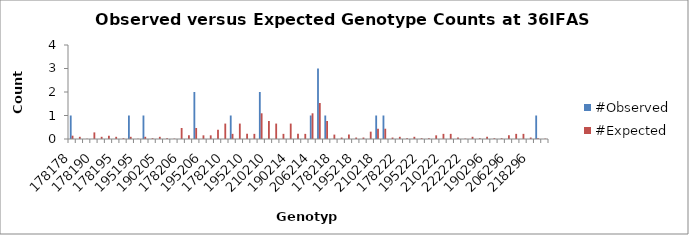
| Category | #Observed | #Expected |
|---|---|---|
| 178178.0 | 1 | 0.141 |
| 178182.0 | 0 | 0.094 |
| 182182.0 | 0 | 0.016 |
| 178190.0 | 0 | 0.281 |
| 182190.0 | 0 | 0.094 |
| 190190.0 | 0 | 0.141 |
| 178195.0 | 0 | 0.094 |
| 182195.0 | 0 | 0.031 |
| 190195.0 | 1 | 0.094 |
| 195195.0 | 0 | 0.016 |
| 178205.0 | 1 | 0.094 |
| 182205.0 | 0 | 0.031 |
| 190205.0 | 0 | 0.094 |
| 195205.0 | 0 | 0.031 |
| 205205.0 | 0 | 0.016 |
| 178206.0 | 0 | 0.469 |
| 182206.0 | 0 | 0.156 |
| 190206.0 | 2 | 0.469 |
| 195206.0 | 0 | 0.156 |
| 205206.0 | 0 | 0.156 |
| 206206.0 | 0 | 0.391 |
| 178210.0 | 0 | 0.656 |
| 182210.0 | 1 | 0.219 |
| 190210.0 | 0 | 0.656 |
| 195210.0 | 0 | 0.219 |
| 205210.0 | 0 | 0.219 |
| 206210.0 | 2 | 1.094 |
| 210210.0 | 0 | 0.766 |
| 178214.0 | 0 | 0.656 |
| 182214.0 | 0 | 0.219 |
| 190214.0 | 0 | 0.656 |
| 195214.0 | 0 | 0.219 |
| 205214.0 | 0 | 0.219 |
| 206214.0 | 1 | 1.094 |
| 210214.0 | 3 | 1.531 |
| 214214.0 | 1 | 0.766 |
| 178218.0 | 0 | 0.188 |
| 182218.0 | 0 | 0.062 |
| 190218.0 | 0 | 0.188 |
| 195218.0 | 0 | 0.062 |
| 205218.0 | 0 | 0.062 |
| 206218.0 | 0 | 0.312 |
| 210218.0 | 1 | 0.438 |
| 214218.0 | 1 | 0.438 |
| 218218.0 | 0 | 0.062 |
| 178222.0 | 0 | 0.094 |
| 182222.0 | 0 | 0.031 |
| 190222.0 | 0 | 0.094 |
| 195222.0 | 0 | 0.031 |
| 205222.0 | 0 | 0.031 |
| 206222.0 | 0 | 0.156 |
| 210222.0 | 0 | 0.219 |
| 214222.0 | 0 | 0.219 |
| 218222.0 | 0 | 0.062 |
| 222222.0 | 0 | 0.016 |
| 178296.0 | 0 | 0.094 |
| 182296.0 | 0 | 0.031 |
| 190296.0 | 0 | 0.094 |
| 195296.0 | 0 | 0.031 |
| 205296.0 | 0 | 0.031 |
| 206296.0 | 0 | 0.156 |
| 210296.0 | 0 | 0.219 |
| 214296.0 | 0 | 0.219 |
| 218296.0 | 0 | 0.062 |
| 222296.0 | 1 | 0.031 |
| 296296.0 | 0 | 0.016 |